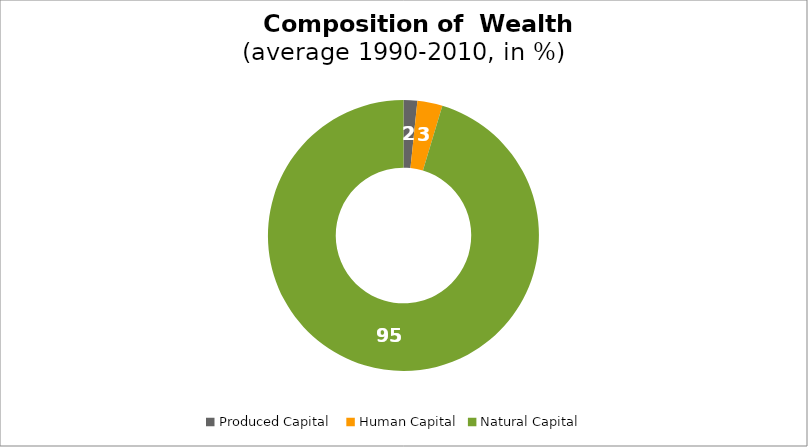
| Category | Series 0 |
|---|---|
| Produced Capital  | 1.641 |
| Human Capital | 2.99 |
| Natural Capital | 95.369 |